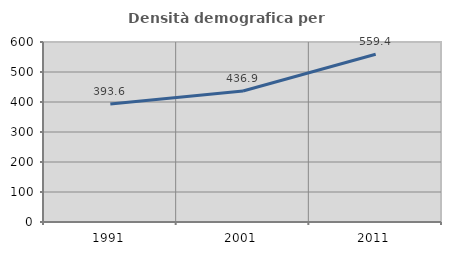
| Category | Densità demografica |
|---|---|
| 1991.0 | 393.642 |
| 2001.0 | 436.897 |
| 2011.0 | 559.391 |